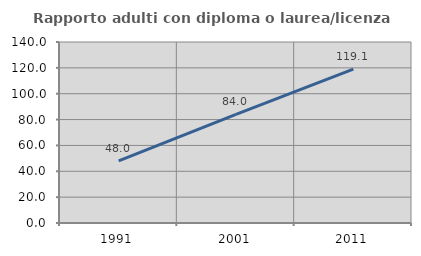
| Category | Rapporto adulti con diploma o laurea/licenza media  |
|---|---|
| 1991.0 | 48.048 |
| 2001.0 | 83.991 |
| 2011.0 | 119.091 |